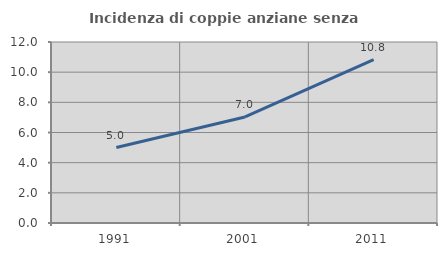
| Category | Incidenza di coppie anziane senza figli  |
|---|---|
| 1991.0 | 5 |
| 2001.0 | 7.031 |
| 2011.0 | 10.829 |